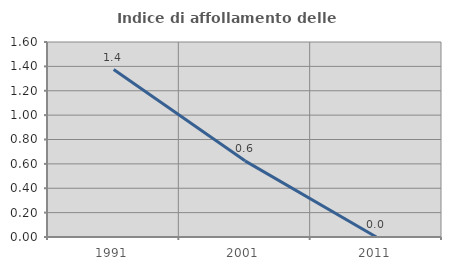
| Category | Indice di affollamento delle abitazioni  |
|---|---|
| 1991.0 | 1.374 |
| 2001.0 | 0.625 |
| 2011.0 | 0 |